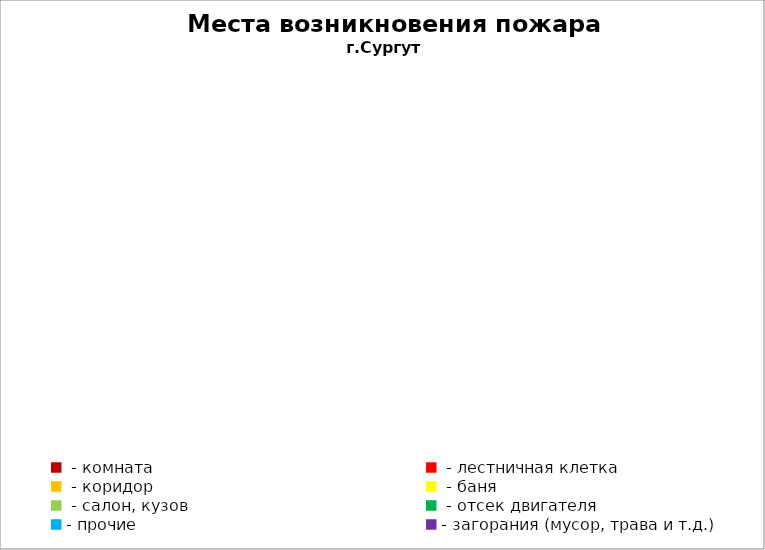
| Category | Места возникновения пожара |
|---|---|
|  - комната | 51 |
|  - лестничная клетка | 23 |
|  - коридор | 4 |
|  - баня | 38 |
|  - салон, кузов | 21 |
|  - отсек двигателя | 29 |
| - прочие | 90 |
| - загорания (мусор, трава и т.д.)  | 161 |